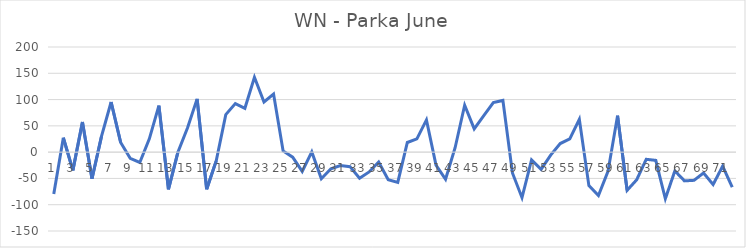
| Category | Series 0 |
|---|---|
| 0 | -79.625 |
| 1 | 27.375 |
| 2 | -34.625 |
| 3 | 57.375 |
| 4 | -50.625 |
| 5 | 30.375 |
| 6 | 95.375 |
| 7 | 18.375 |
| 8 | -11.625 |
| 9 | -19.625 |
| 10 | 25.375 |
| 11 | 88.375 |
| 12 | -70.625 |
| 13 | 0.375 |
| 14 | 46.375 |
| 15 | 101.375 |
| 16 | -70.625 |
| 17 | -16.625 |
| 18 | 71.375 |
| 19 | 92.375 |
| 20 | 83.375 |
| 21 | 142.375 |
| 22 | 95.375 |
| 23 | 110.375 |
| 24 | 2.375 |
| 25 | -9.625 |
| 26 | -36.625 |
| 27 | 0.375 |
| 28 | -50.625 |
| 29 | -31.625 |
| 30 | -25.625 |
| 31 | -27.625 |
| 32 | -49.625 |
| 33 | -37.625 |
| 34 | -18.625 |
| 35 | -52.625 |
| 36 | -57.625 |
| 37 | 18.375 |
| 38 | 25.375 |
| 39 | 61.375 |
| 40 | -24.625 |
| 41 | -51.625 |
| 42 | 8.375 |
| 43 | 89.375 |
| 44 | 44.375 |
| 45 | 69.375 |
| 46 | 94.375 |
| 47 | 98.375 |
| 48 | -39.625 |
| 49 | -86.625 |
| 50 | -14.625 |
| 51 | -32.625 |
| 52 | -5.625 |
| 53 | 16.375 |
| 54 | 25.375 |
| 55 | 62.375 |
| 56 | -63.625 |
| 57 | -82.625 |
| 58 | -36.625 |
| 59 | 69.375 |
| 60 | -72.625 |
| 61 | -52.625 |
| 62 | -13.625 |
| 63 | -15.625 |
| 64 | -88.625 |
| 65 | -35.625 |
| 66 | -54.625 |
| 67 | -53.625 |
| 68 | -39.625 |
| 69 | -61.625 |
| 70 | -26.625 |
| 71 | -66.625 |